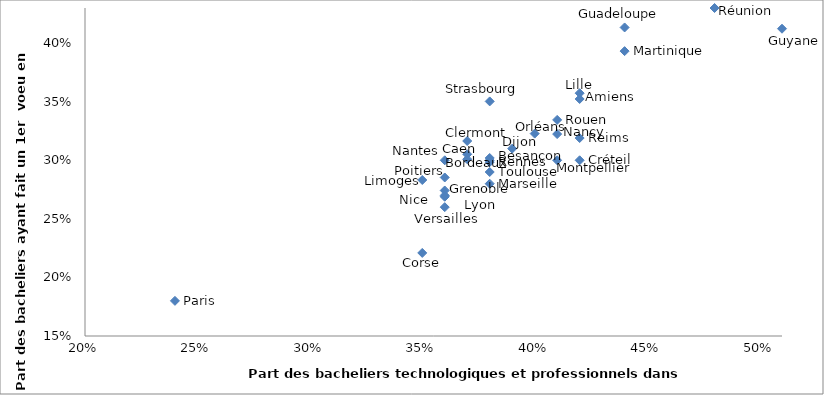
| Category | Part des 1ers vœux en STS |
|---|---|
| 0.37 | 0.316 |
| 0.36 | 0.269 |
| 0.36 | 0.274 |
| 0.38 | 0.302 |
| 0.39 | 0.31 |
| 0.38 | 0.298 |
| 0.4 | 0.323 |
| 0.35 | 0.221 |
| 0.41 | 0.322 |
| 0.38 | 0.35 |
| 0.42 | 0.319 |
| 0.44 | 0.413 |
| 0.51 | 0.412 |
| 0.42 | 0.357 |
| 0.42 | 0.352 |
| 0.24 | 0.18 |
| 0.42 | 0.3 |
| 0.36 | 0.26 |
| 0.48 | 0.424 |
| 0.44 | 0.393 |
| 0.59 | 0.584 |
| 0.37 | 0.305 |
| 0.41 | 0.334 |
| 0.37 | 0.301 |
| 0.36 | 0.285 |
| 0.35 | 0.283 |
| 0.41 | 0.3 |
| 0.38 | 0.29 |
| 0.36 | 0.3 |
| 0.38 | 0.28 |
| 0.36 | 0.27 |
| 0.38 | 0.3 |
| 0.48 | 0.43 |